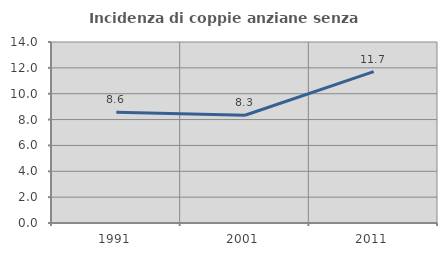
| Category | Incidenza di coppie anziane senza figli  |
|---|---|
| 1991.0 | 8.571 |
| 2001.0 | 8.333 |
| 2011.0 | 11.712 |